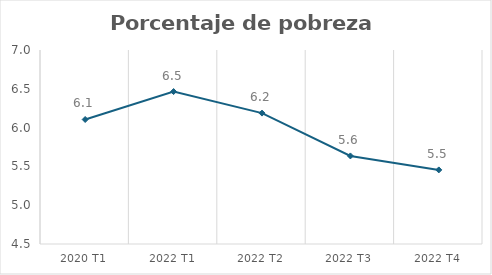
| Category | Series 0 |
|---|---|
| 2020 T1 | 6.104 |
| 2022 T1 | 6.464 |
| 2022 T2 | 6.187 |
| 2022 T3 | 5.635 |
| 2022 T4 | 5.455 |